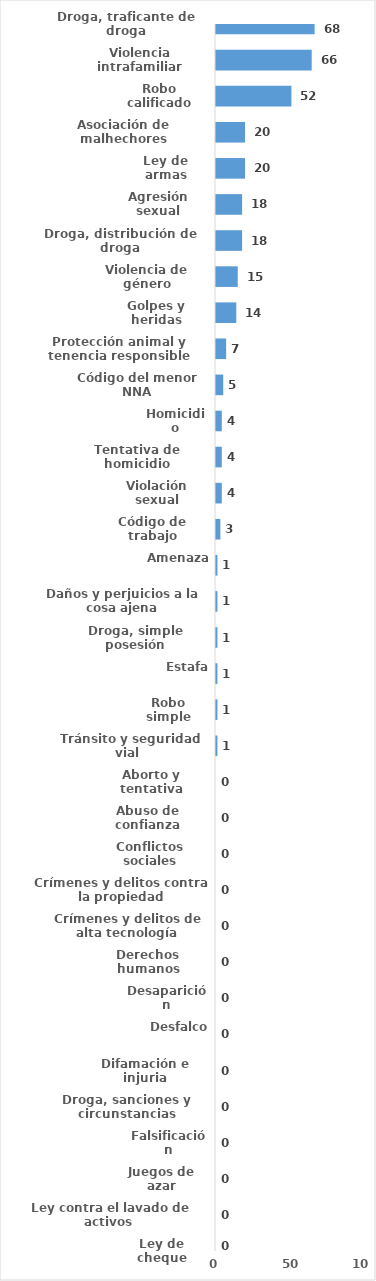
| Category | Series 0 |
|---|---|
| Droga, traficante de droga | 68 |
| Violencia intrafamiliar | 66 |
| Robo calificado | 52 |
| Asociación de malhechores | 20 |
| Ley de armas | 20 |
| Agresión sexual | 18 |
| Droga, distribución de droga | 18 |
| Violencia de género | 15 |
| Golpes y heridas | 14 |
| Protección animal y tenencia responsible | 7 |
| Código del menor NNA | 5 |
| Homicidio | 4 |
| Tentativa de homicidio | 4 |
| Violación sexual | 4 |
| Código de trabajo | 3 |
| Amenaza | 1 |
| Daños y perjuicios a la cosa ajena | 1 |
| Droga, simple posesión | 1 |
| Estafa | 1 |
| Robo simple | 1 |
| Tránsito y seguridad vial  | 1 |
| Aborto y tentativa | 0 |
| Abuso de confianza | 0 |
| Conflictos sociales | 0 |
| Crímenes y delitos contra la propiedad | 0 |
| Crímenes y delitos de alta tecnología | 0 |
| Derechos humanos | 0 |
| Desaparición | 0 |
| Desfalco | 0 |
| Difamación e injuria | 0 |
| Droga, sanciones y circunstancias agravantes | 0 |
| Falsificación | 0 |
| Juegos de azar | 0 |
| Ley contra el lavado de activos  | 0 |
| Ley de cheque | 0 |